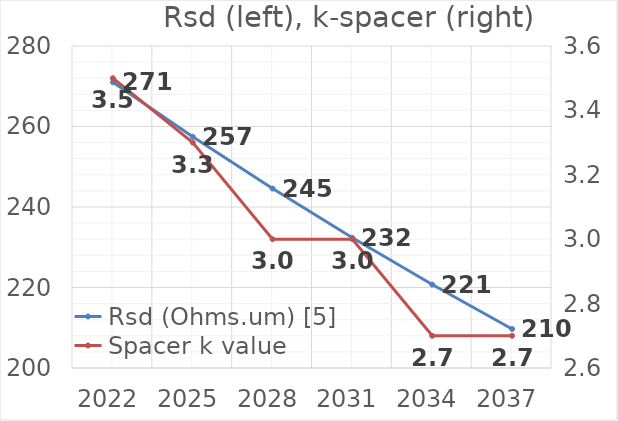
| Category | Rsd (Ohms.um) [5] |
|---|---|
| 2022.0 | 271 |
| 2025.0 | 257.45 |
| 2028.0 | 244.578 |
| 2031.0 | 232.349 |
| 2034.0 | 220.731 |
| 2037.0 | 209.695 |